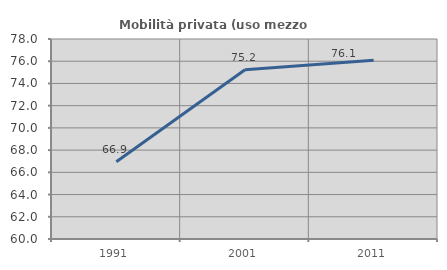
| Category | Mobilità privata (uso mezzo privato) |
|---|---|
| 1991.0 | 66.949 |
| 2001.0 | 75.238 |
| 2011.0 | 76.096 |